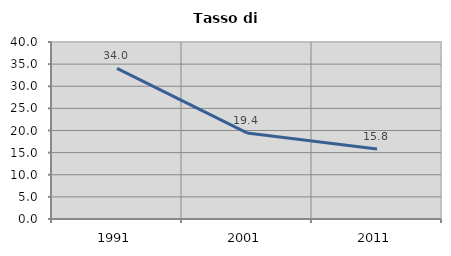
| Category | Tasso di disoccupazione   |
|---|---|
| 1991.0 | 34.037 |
| 2001.0 | 19.444 |
| 2011.0 | 15.799 |